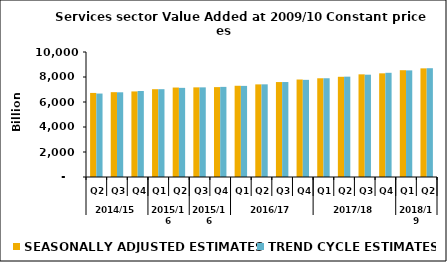
| Category | SEASONALLY ADJUSTED ESTIMATES | TREND CYCLE ESTIMATES |
|---|---|---|
| 0 | 6725.563 | 6675.857 |
| 1 | 6786.228 | 6775.975 |
| 2 | 6845.444 | 6880.82 |
| 3 | 7022.77 | 7024.719 |
| 4 | 7157.197 | 7131.633 |
| 5 | 7170.935 | 7171.063 |
| 6 | 7190.61 | 7208.883 |
| 7 | 7298.375 | 7288.175 |
| 8 | 7409.257 | 7413.217 |
| 9 | 7595.354 | 7597.749 |
| 10 | 7798.424 | 7772.136 |
| 11 | 7898.217 | 7899.484 |
| 12 | 8016.348 | 8027.175 |
| 13 | 8212.529 | 8183.95 |
| 14 | 8293.254 | 8336.178 |
| 15 | 8543.646 | 8529.915 |
| 16 | 8691.148 | 8703.012 |